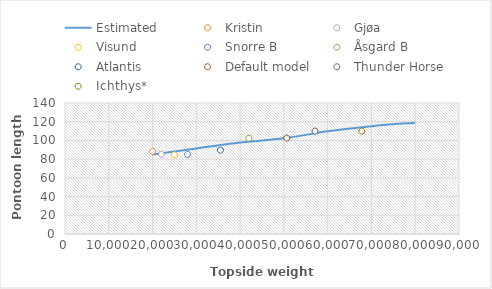
| Category | Estimated |
|---|---|
| 20000.0 | 85 |
| 30000.0 | 91.4 |
| 40000.0 | 97.7 |
| 50000.0 | 102.3 |
| 60000.0 | 109.7 |
| 70000.0 | 115.2 |
| 80000.0 | 118.9 |